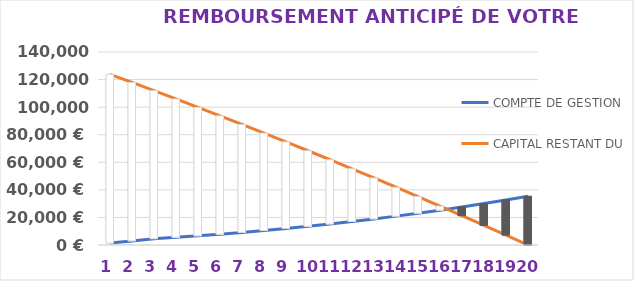
| Category | COMPTE DE GESTION | CAPITAL RESTANT DU |
|---|---|---|
| 0 | 1392.238 | 123799.429 |
| 1 | 2982.076 | 117908.248 |
| 2 | 4569.49 | 111951.936 |
| 3 | 5559.456 | 105929.774 |
| 4 | 6645.287 | 99841.033 |
| 5 | 7828.196 | 93684.978 |
| 6 | 9109.415 | 87460.863 |
| 7 | 10490.186 | 81167.936 |
| 8 | 11971.772 | 74805.438 |
| 9 | 13555.448 | 68372.598 |
| 10 | 15242.508 | 61868.638 |
| 11 | 17034.261 | 55292.774 |
| 12 | 18932.031 | 48644.209 |
| 13 | 20937.163 | 41922.14 |
| 14 | 23051.014 | 35125.755 |
| 15 | 25274.962 | 28254.231 |
| 16 | 27610.401 | 21306.738 |
| 17 | 30058.743 | 14282.436 |
| 18 | 32621.416 | 7180.476 |
| 19 | 35299.868 | 0 |